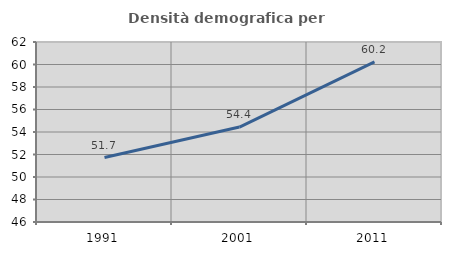
| Category | Densità demografica |
|---|---|
| 1991.0 | 51.726 |
| 2001.0 | 54.439 |
| 2011.0 | 60.232 |